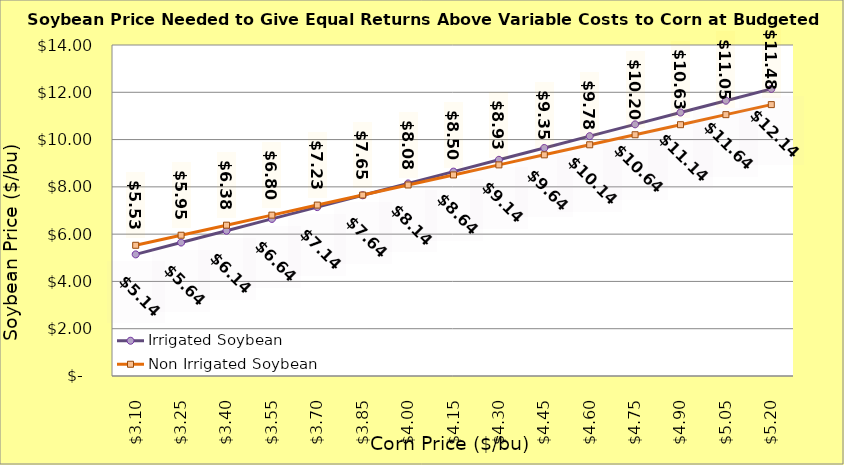
| Category | Irrigated Soybean | Non Irrigated Soybean |
|---|---|---|
| 3.1000000000000005 | 5.144 | 5.529 |
| 3.2500000000000004 | 5.644 | 5.954 |
| 3.4000000000000004 | 6.144 | 6.379 |
| 3.5500000000000003 | 6.644 | 6.804 |
| 3.7 | 7.144 | 7.229 |
| 3.85 | 7.644 | 7.654 |
| 4.0 | 8.144 | 8.079 |
| 4.15 | 8.644 | 8.504 |
| 4.300000000000001 | 9.144 | 8.929 |
| 4.450000000000001 | 9.644 | 9.354 |
| 4.600000000000001 | 10.144 | 9.779 |
| 4.750000000000002 | 10.644 | 10.204 |
| 4.900000000000002 | 11.144 | 10.629 |
| 5.0500000000000025 | 11.644 | 11.054 |
| 5.200000000000003 | 12.144 | 11.479 |